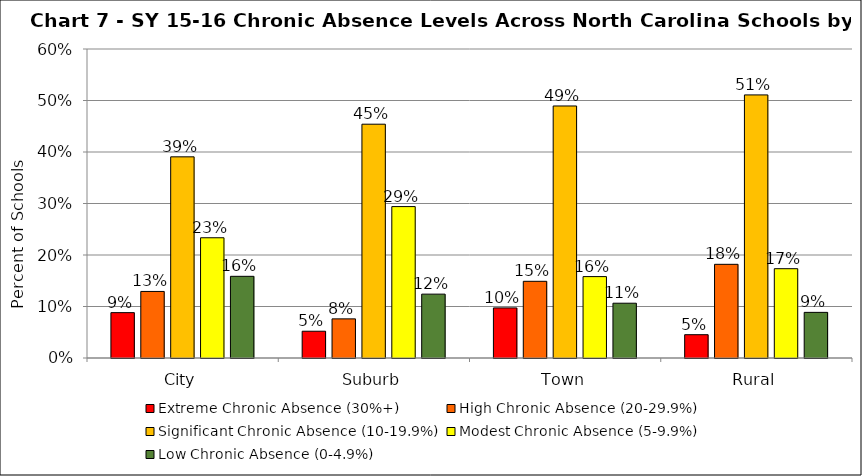
| Category | Extreme Chronic Absence (30%+) | High Chronic Absence (20-29.9%) | Significant Chronic Absence (10-19.9%) | Modest Chronic Absence (5-9.9%) | Low Chronic Absence (0-4.9%) |
|---|---|---|---|---|---|
| 0 | 0.088 | 0.129 | 0.391 | 0.233 | 0.159 |
| 1 | 0.052 | 0.076 | 0.454 | 0.294 | 0.124 |
| 2 | 0.097 | 0.149 | 0.489 | 0.158 | 0.106 |
| 3 | 0.045 | 0.182 | 0.511 | 0.173 | 0.089 |